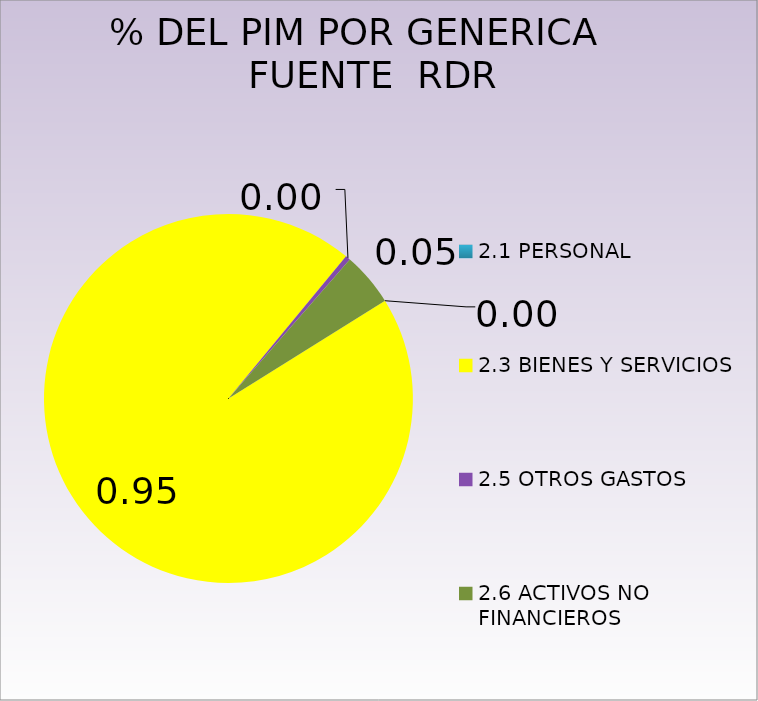
| Category | Series 0 |
|---|---|
| 2.1 PERSONAL | 0 |
| 2.3 BIENES Y SERVICIOS | 7116745 |
| 2.5 OTROS GASTOS  | 31913 |
| 2.6 ACTIVOS NO FINANCIEROS  | 351850 |